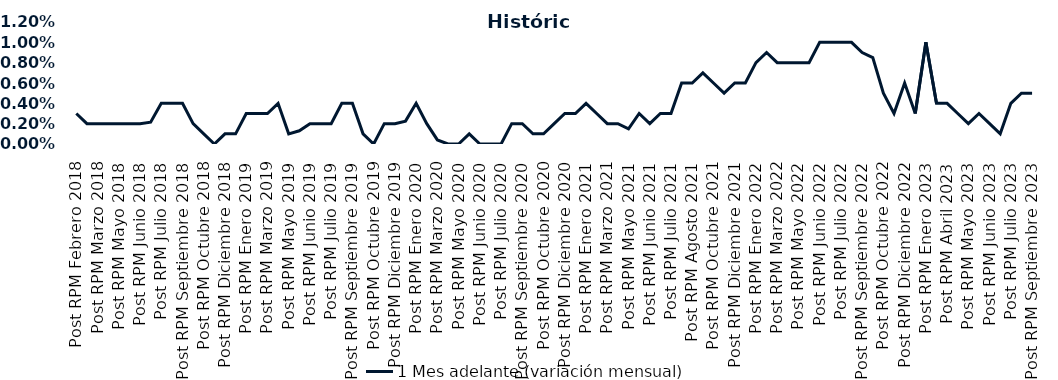
| Category | 1 Mes adelante (variación mensual) |
|---|---|
| Post RPM Febrero 2018 | 0.003 |
| Pre RPM Marzo 2018 | 0.002 |
| Post RPM Marzo 2018 | 0.002 |
| Pre RPM Mayo 2018 | 0.002 |
| Post RPM Mayo 2018 | 0.002 |
| Pre RPM Junio 2018 | 0.002 |
| Post RPM Junio 2018 | 0.002 |
| Pre RPM Julio 2018 | 0.002 |
| Post RPM Julio 2018 | 0.004 |
| Pre RPM Septiembre 2018 | 0.004 |
| Post RPM Septiembre 2018 | 0.004 |
| Pre RPM Octubre 2018 | 0.002 |
| Post RPM Octubre 2018 | 0.001 |
| Pre RPM Diciembre 2018 | 0 |
| Post RPM Diciembre 2018 | 0.001 |
| Pre RPM Enero 2019 | 0.001 |
| Post RPM Enero 2019 | 0.003 |
| Pre RPM Marzo 2019 | 0.003 |
| Post RPM Marzo 2019 | 0.003 |
| Pre RPM Mayo 2019 | 0.004 |
| Post RPM Mayo 2019 | 0.001 |
| Pre RPM Junio 2019 | 0.001 |
| Post RPM Junio 2019 | 0.002 |
| Pre RPM Julio 2019 | 0.002 |
| Post RPM Julio 2019 | 0.002 |
| Pre RPM Septiembre 2019 | 0.004 |
| Post RPM Septiembre 2019 | 0.004 |
| Pre RPM Octubre 2019 | 0.001 |
| Post RPM Octubre 2019 | 0 |
| Pre RPM Diciembre 2019 | 0.002 |
| Post RPM Diciembre 2019 | 0.002 |
| Pre RPM Enero 2020 | 0.002 |
| Post RPM Enero 2020 | 0.004 |
| Pre RPM Marzo 2020 | 0.002 |
| Post RPM Marzo 2020 | 0 |
| Pre RPM Mayo 2020 | 0 |
| Post RPM Mayo 2020 | 0 |
| Pre RPM Junio 2020 | 0.001 |
| Post RPM Junio 2020 | 0 |
| Pre RPM Julio 2020 | 0 |
| Post RPM Julio 2020 | 0 |
| Pre RPM Septiembre 2020 | 0.002 |
| Post RPM Septiembre 2020 | 0.002 |
| Pre RPM Octubre 2020 | 0.001 |
| Post RPM Octubre 2020 | 0.001 |
| Pre RPM Diciembre 2020 | 0.002 |
| Post RPM Diciembre 2020 | 0.003 |
| Pre RPM Enero 2021 | 0.003 |
| Post RPM Enero 2021 | 0.004 |
| Pre RPM Marzo 2021 | 0.003 |
| Post RPM Marzo 2021 | 0.002 |
| Pre RPM Mayo 2021 | 0.002 |
| Post RPM Mayo 2021 | 0.002 |
| Pre RPM Junio 2021 | 0.003 |
| Post RPM Junio 2021 | 0.002 |
| Pre RPM Julio 2021 | 0.003 |
| Post RPM Julio 2021 | 0.003 |
| Pre RPM Agosto 2021 | 0.006 |
| Post RPM Agosto 2021 | 0.006 |
| Pre RPM Octubre 2021 | 0.007 |
| Post RPM Octubre 2021 | 0.006 |
| Pre RPM Diciembre 2021 | 0.005 |
| Post RPM Diciembre 2021 | 0.006 |
| Pre RPM Enero 2022 | 0.006 |
| Post RPM Enero 2022 | 0.008 |
| Pre RPM Marzo 2022 | 0.009 |
| Post RPM Marzo 2022 | 0.008 |
| Pre RPM Mayo 2022 | 0.008 |
| Post RPM Mayo 2022 | 0.008 |
| Pre RPM Junio 2022 | 0.008 |
| Post RPM Junio 2022 | 0.01 |
| Pre RPM Julio 2022 | 0.01 |
| Post RPM Julio 2022 | 0.01 |
| Pre RPM Septiembre 2022 | 0.01 |
| Post RPM Septiembre 2022 | 0.009 |
| Pre RPM Octubre 2022 | 0.008 |
| Post RPM Octubre 2022 | 0.005 |
| Pre RPM Diciembre 2022 | 0.003 |
| Post RPM Diciembre 2022 | 0.006 |
| Pre RPM Enero 2023 | 0.003 |
| Post RPM Enero 2023 | 0.01 |
| Pre RPM Abril 2023 | 0.004 |
| Post RPM Abril 2023 | 0.004 |
| Pre RPM Mayo 2023 | 0.003 |
| Post RPM Mayo 2023 | 0.002 |
| Pre RPM Junio 2023 | 0.003 |
| Post RPM Junio 2023 | 0.002 |
| Pre RPM Julio 2023 | 0.001 |
| Post RPM Julio 2023 | 0.004 |
| Pre RPM Septiembre 2023 | 0.005 |
| Post RPM Septiembre 2023 | 0.005 |